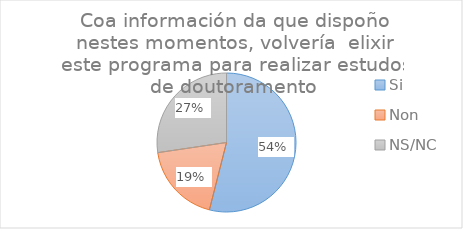
| Category | Series 25 |
|---|---|
| Si | 75 |
| Non | 26 |
| NS/NC | 38 |